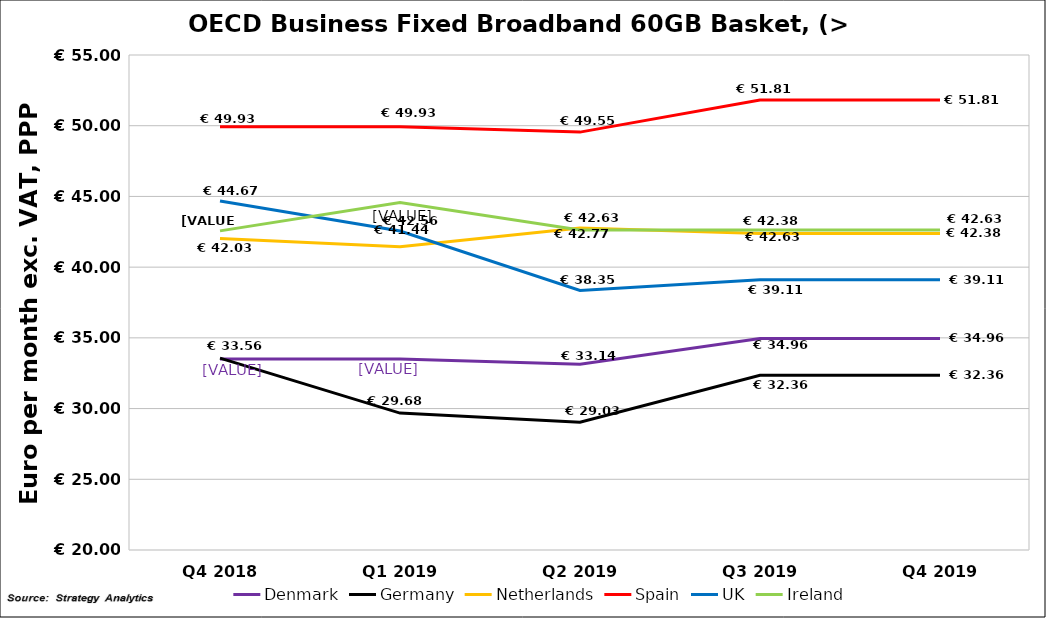
| Category | Denmark | Germany | Netherlands | Spain | UK | Ireland |
|---|---|---|---|---|---|---|
| Q4 2018 | 33.504 | 33.563 | 42.033 | 49.931 | 44.669 | 42.564 |
| Q1 2019 | 33.504 | 29.681 | 41.442 | 49.931 | 42.558 | 44.577 |
| Q2 2019 | 33.136 | 29.034 | 42.773 | 49.548 | 38.347 | 42.631 |
| Q3 2019 | 34.96 | 32.356 | 42.38 | 51.81 | 39.114 | 42.631 |
| Q4 2019 | 34.96 | 32.36 | 42.38 | 51.81 | 39.11 | 42.631 |